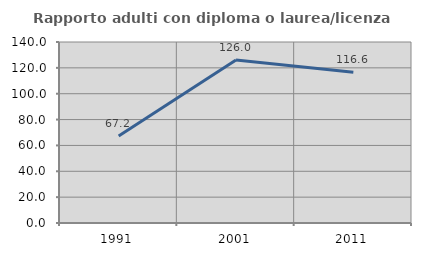
| Category | Rapporto adulti con diploma o laurea/licenza media  |
|---|---|
| 1991.0 | 67.241 |
| 2001.0 | 126.019 |
| 2011.0 | 116.556 |